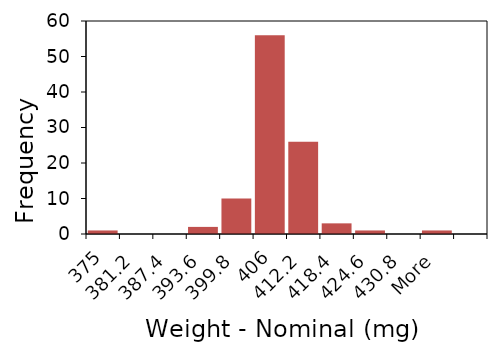
| Category | Series 1 |
|---|---|
| 375 | 1 |
| 381.2 | 0 |
| 387.4 | 0 |
| 393.6 | 2 |
| 399.8 | 10 |
| 406 | 56 |
| 412.2 | 26 |
| 418.4 | 3 |
| 424.6 | 1 |
| 430.8 | 0 |
| More | 1 |